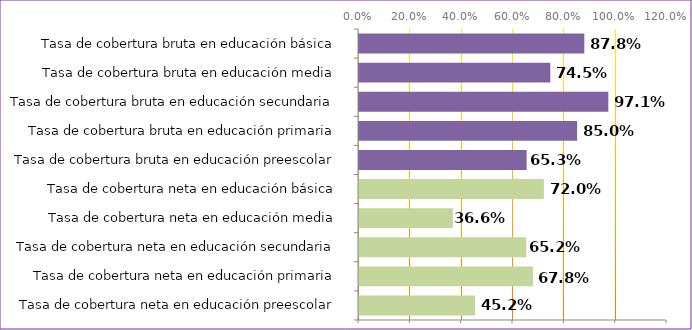
| Category | Series 0 |
|---|---|
| Tasa de cobertura neta en educación preescolar | 0.452 |
| Tasa de cobertura neta en educación primaria | 0.678 |
| Tasa de cobertura neta en educación secundaria | 0.652 |
| Tasa de cobertura neta en educación media | 0.366 |
| Tasa de cobertura neta en educación básica | 0.72 |
| Tasa de cobertura bruta en educación preescolar | 0.653 |
| Tasa de cobertura bruta en educación primaria | 0.85 |
| Tasa de cobertura bruta en educación secundaria | 0.971 |
| Tasa de cobertura bruta en educación media | 0.745 |
| Tasa de cobertura bruta en educación básica | 0.878 |